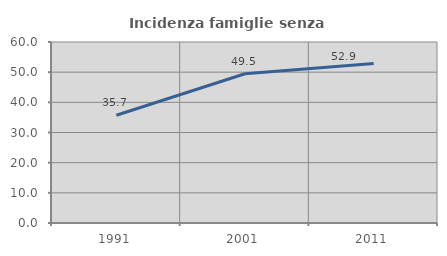
| Category | Incidenza famiglie senza nuclei |
|---|---|
| 1991.0 | 35.714 |
| 2001.0 | 49.468 |
| 2011.0 | 52.88 |